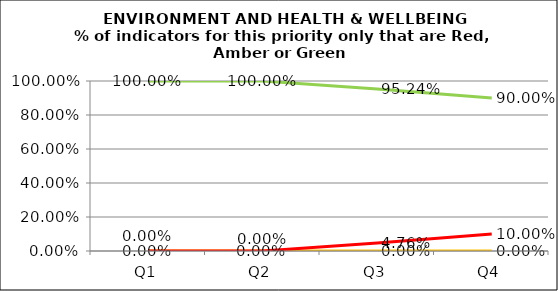
| Category | Green | Amber | Red |
|---|---|---|---|
| Q1 | 1 | 0 | 0 |
| Q2 | 1 | 0 | 0 |
| Q3 | 0.952 | 0 | 0.048 |
| Q4 | 0.9 | 0 | 0.1 |